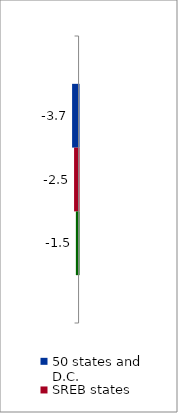
| Category | 50 states and D.C. | SREB states | State |
|---|---|---|---|
| 2011 to 2016 | -3.659 | -2.54 | -1.528 |